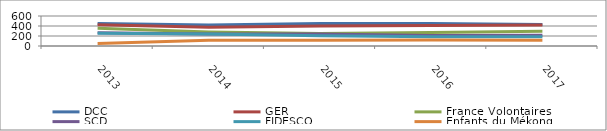
| Category | DCC | GER | France Volontaires | SCD | FIDESCO | Enfants du Mékong |
|---|---|---|---|---|---|---|
| 2013.0 | 448 | 424 | 356 | 265 | 253 | 51 |
| 2014.0 | 421 | 374 | 282 | 242 | 241 | 113 |
| 2015.0 | 449 | 400 | 250 | 240 | 205 | 113 |
| 2016.0 | 449 | 409 | 270 | 209 | 187 | 121 |
| 2017.0 | 429 | 422 | 293 | 213 | 187 | 115 |